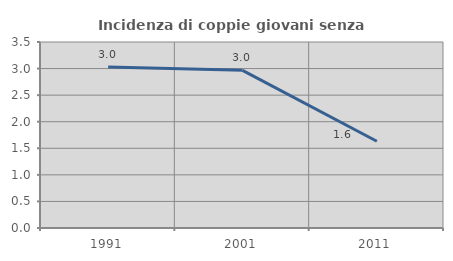
| Category | Incidenza di coppie giovani senza figli |
|---|---|
| 1991.0 | 3.029 |
| 2001.0 | 2.966 |
| 2011.0 | 1.631 |